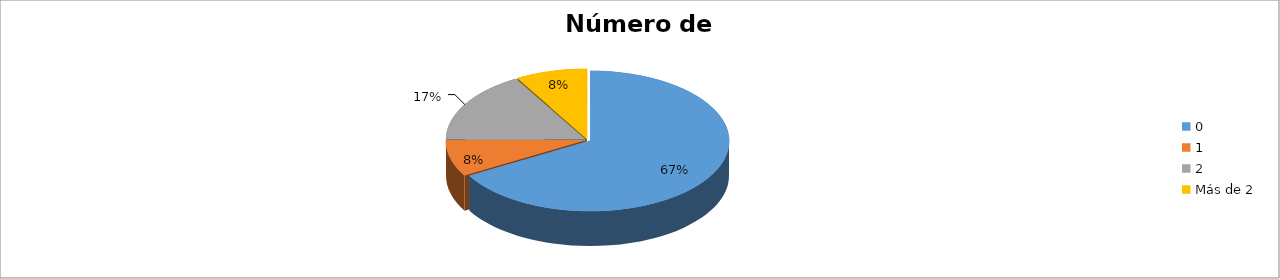
| Category | Series 0 |
|---|---|
| 0 | 0.667 |
| 1 | 0.083 |
| 2 | 0.167 |
| Más de 2 | 0.083 |